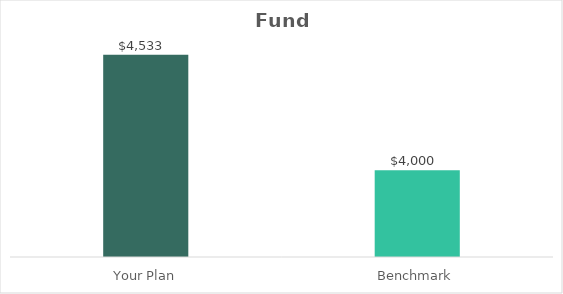
| Category | Series 0 |
|---|---|
| Your Plan | 4532.5 |
| Benchmark | 4000 |